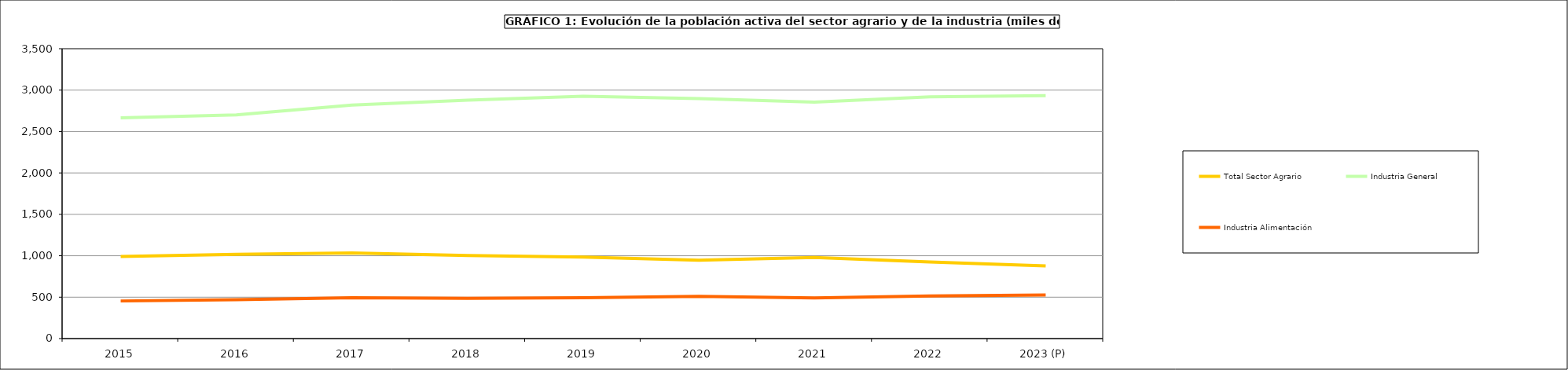
| Category | Total Sector Agrario | Industria General | Industria Alimentación |
|---|---|---|---|
| 2015 | 990.325 | 2664.9 | 454.1 |
| 2016 | 1016.75 | 2699.875 | 468.93 |
| 2017 | 1034 | 2818.575 | 494.3 |
| 2018 | 1002.675 | 2878.075 | 485.3 |
| 2019 | 983.3 | 2927.275 | 493.625 |
| 2020 | 946.55 | 2898.525 | 508.925 |
| 2021 | 979.9 | 2854.95 | 490.375 |
| 2022 | 925.9 | 2918 | 514.275 |
| 2023 (P) | 877.8 | 2934 | 525.475 |